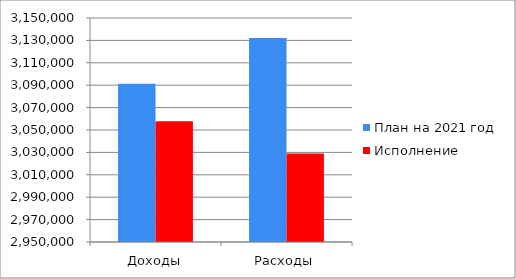
| Category | План на 2021 год | Исполнение |
|---|---|---|
| Доходы | 3091341 | 3057744.013 |
| Расходы | 3132168 | 3029071.668 |